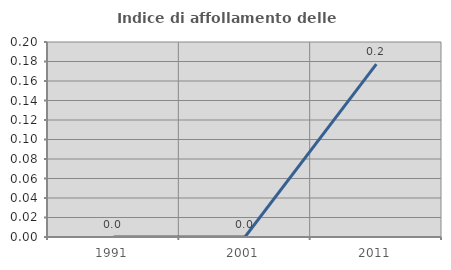
| Category | Indice di affollamento delle abitazioni  |
|---|---|
| 1991.0 | 0 |
| 2001.0 | 0 |
| 2011.0 | 0.177 |